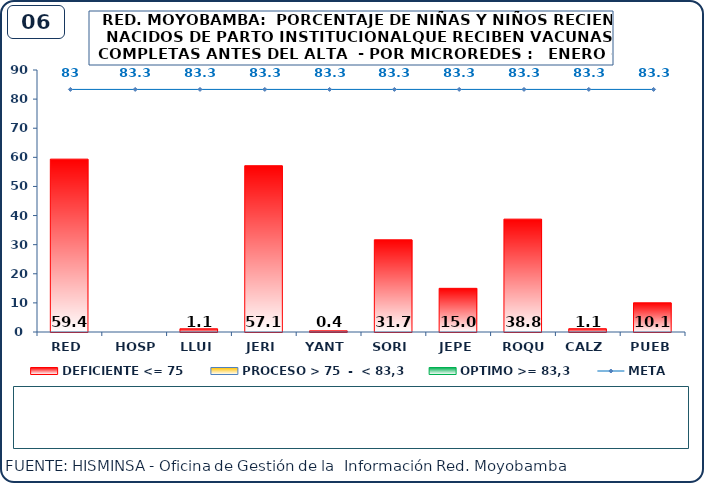
| Category | DEFICIENTE <= 75 | PROCESO > 75  -  < 83,3 | OPTIMO >= 83,3 |
|---|---|---|---|
| RED | 59.38 | 0 | 0 |
| HOSP | 0 | 0 | 0 |
| LLUI | 1.12 | 0 | 0 |
| JERI | 57.14 | 0 | 0 |
| YANT | 0.41 | 0 | 0 |
| SORI | 31.69 | 0 | 0 |
| JEPE | 15 | 0 | 0 |
| ROQU | 38.77 | 0 | 0 |
| CALZ | 1.14 | 0 | 0 |
| PUEB | 10.05 | 0 | 0 |